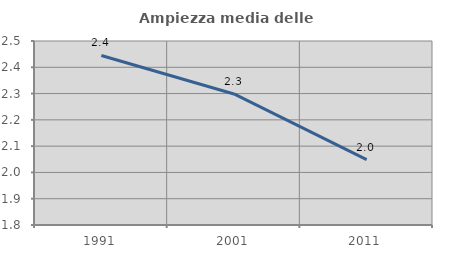
| Category | Ampiezza media delle famiglie |
|---|---|
| 1991.0 | 2.445 |
| 2001.0 | 2.299 |
| 2011.0 | 2.049 |